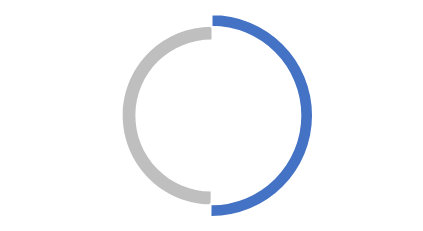
| Category | 2021 |
|---|---|
| Suma de Total pes familia assolit per municipi | 14912.5 |
| Pendent de consecució | -14812.5 |